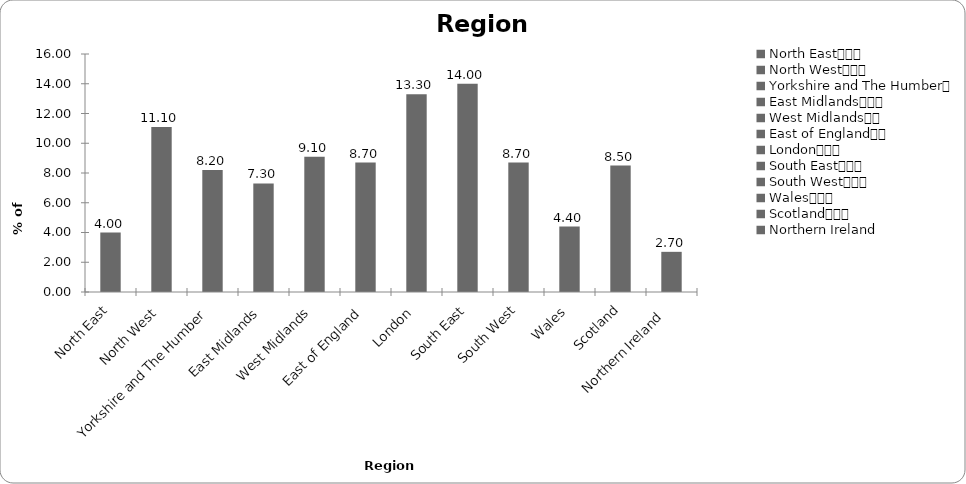
| Category | Region |
|---|---|
| North East			 | 4 |
| North West			 | 11.1 |
| Yorkshire and The Humber	 | 8.2 |
| East Midlands			 | 7.3 |
| West Midlands		 | 9.1 |
| East of England		 | 8.7 |
| London			 | 13.3 |
| South East			 | 14 |
| South West			 | 8.7 |
| Wales			 | 4.4 |
| Scotland			 | 8.5 |
| Northern Ireland  | 2.7 |